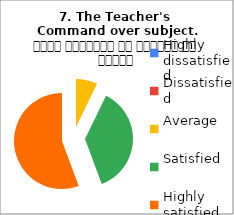
| Category | 7. The Teacher's 
Command over subject. विषय अवधारणा पर शिक्षक का ज्ञान |
|---|---|
| Highly dissatisfied | 0 |
| Dissatisfied | 0 |
| Average | 7 |
| Satisfied | 36 |
| Highly satisfied | 54 |